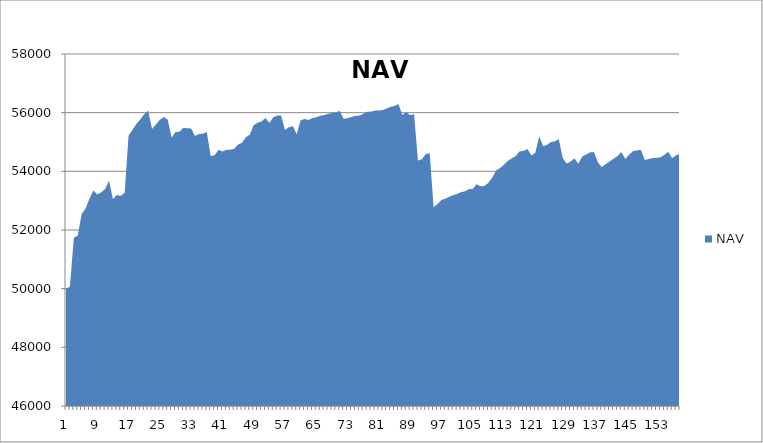
| Category | NAV |
|---|---|
| 0 | 50000 |
| 1 | 50069.444 |
| 2 | 51736.444 |
| 3 | 51809.343 |
| 4 | 52539.343 |
| 5 | 52733.57 |
| 6 | 53070.527 |
| 7 | 53346.212 |
| 8 | 53210.13 |
| 9 | 53285.788 |
| 10 | 53396.685 |
| 11 | 53684.185 |
| 12 | 53050.597 |
| 13 | 53191.058 |
| 14 | 53162.649 |
| 15 | 53270.317 |
| 16 | 55214.762 |
| 17 | 55418.583 |
| 18 | 55617.273 |
| 19 | 55770.477 |
| 20 | 55945.477 |
| 21 | 56069.601 |
| 22 | 55444.601 |
| 23 | 55597.925 |
| 24 | 55757.558 |
| 25 | 55851.308 |
| 26 | 55764.06 |
| 27 | 55148.361 |
| 28 | 55340.028 |
| 29 | 55349.317 |
| 30 | 55485.393 |
| 31 | 55468.704 |
| 32 | 55461.038 |
| 33 | 55205.356 |
| 34 | 55270.356 |
| 35 | 55282.57 |
| 36 | 55341.011 |
| 37 | 54517.482 |
| 38 | 54554.291 |
| 39 | 54731.016 |
| 40 | 54679.093 |
| 41 | 54730.595 |
| 42 | 54736.73 |
| 43 | 54765.085 |
| 44 | 54915.643 |
| 45 | 54969.86 |
| 46 | 55164.665 |
| 47 | 55247.746 |
| 48 | 55575.668 |
| 49 | 55657.905 |
| 50 | 55701.032 |
| 51 | 55819.28 |
| 52 | 55652.834 |
| 53 | 55838.604 |
| 54 | 55905.769 |
| 55 | 55898.888 |
| 56 | 55410.9 |
| 57 | 55504.564 |
| 58 | 55537.603 |
| 59 | 55268.471 |
| 60 | 55737.858 |
| 61 | 55785.708 |
| 62 | 55749.829 |
| 63 | 55815.591 |
| 64 | 55842.34 |
| 65 | 55894.021 |
| 66 | 55916.828 |
| 67 | 55955.697 |
| 68 | 55991.896 |
| 69 | 56012.065 |
| 70 | 56060.293 |
| 71 | 55791.443 |
| 72 | 55810.674 |
| 73 | 55852.843 |
| 74 | 55892.018 |
| 75 | 55900.069 |
| 76 | 55955.739 |
| 77 | 56030.918 |
| 78 | 56036.168 |
| 79 | 56069.975 |
| 80 | 56071.656 |
| 81 | 56090.406 |
| 82 | 56141.798 |
| 83 | 56199.159 |
| 84 | 56228.237 |
| 85 | 56292.573 |
| 86 | 55924.369 |
| 87 | 56019.106 |
| 88 | 55916.165 |
| 89 | 55950.09 |
| 90 | 54367.13 |
| 91 | 54411.811 |
| 92 | 54588.933 |
| 93 | 54611.197 |
| 94 | 52777.117 |
| 95 | 52883.107 |
| 96 | 53025.651 |
| 97 | 53064.908 |
| 98 | 53135.652 |
| 99 | 53186.005 |
| 100 | 53229.789 |
| 101 | 53290.192 |
| 102 | 53319.038 |
| 103 | 53392.112 |
| 104 | 53401.462 |
| 105 | 53559.878 |
| 106 | 53489.526 |
| 107 | 53501.684 |
| 108 | 53607.597 |
| 109 | 53785.178 |
| 110 | 54030.211 |
| 111 | 54113.452 |
| 112 | 54226.272 |
| 113 | 54358.625 |
| 114 | 54444.736 |
| 115 | 54518.421 |
| 116 | 54681.882 |
| 117 | 54693.454 |
| 118 | 54759.719 |
| 119 | 54542.637 |
| 120 | 54631.804 |
| 121 | 55189.582 |
| 122 | 54857.283 |
| 123 | 54902.45 |
| 124 | 54998.878 |
| 125 | 55024.352 |
| 126 | 55097.595 |
| 127 | 54460.788 |
| 128 | 54265.386 |
| 129 | 54330.201 |
| 130 | 54444.032 |
| 131 | 54258.967 |
| 132 | 54502.531 |
| 133 | 54576.689 |
| 134 | 54645.616 |
| 135 | 54655.645 |
| 136 | 54306.491 |
| 137 | 54146.917 |
| 138 | 54245.601 |
| 139 | 54336.218 |
| 140 | 54425.943 |
| 141 | 54524.223 |
| 142 | 54658.516 |
| 143 | 54423.271 |
| 144 | 54567.668 |
| 145 | 54687.668 |
| 146 | 54715.668 |
| 147 | 54729.584 |
| 148 | 54383.43 |
| 149 | 54420.248 |
| 150 | 54450.791 |
| 151 | 54457.1 |
| 152 | 54477.818 |
| 153 | 54563.112 |
| 154 | 54666.053 |
| 155 | 54446.722 |
| 156 | 54545.273 |
| 157 | 54599.818 |